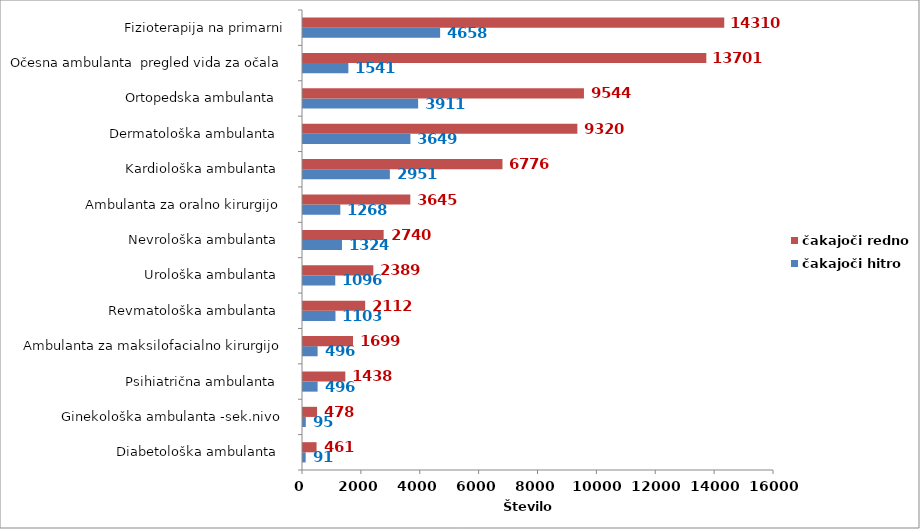
| Category | čakajoči hitro | čakajoči redno |
|---|---|---|
| Diabetološka ambulanta   | 91 | 461 |
| Ginekološka ambulanta -sek.nivo  | 95 | 478 |
| Psihiatrična ambulanta   | 496 | 1438 |
| Ambulanta za maksilofacialno kirurgijo  | 496 | 1699 |
| Revmatološka ambulanta   | 1103 | 2112 |
| Urološka ambulanta   | 1096 | 2389 |
| Nevrološka ambulanta   | 1324 | 2740 |
| Ambulanta za oralno kirurgijo  | 1268 | 3645 |
| Kardiološka ambulanta   | 2951 | 6776 |
| Dermatološka ambulanta   | 3649 | 9320 |
| Ortopedska ambulanta   | 3911 | 9544 |
| Očesna ambulanta  pregled vida za očala | 1541 | 13701 |
| Fizioterapija na primarni | 4658 | 14310 |